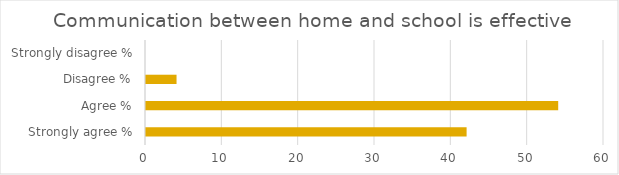
| Category | Series 1 |
|---|---|
| Strongly agree % | 42 |
| Agree % | 54 |
| Disagree % | 4 |
| Strongly disagree % | 0 |